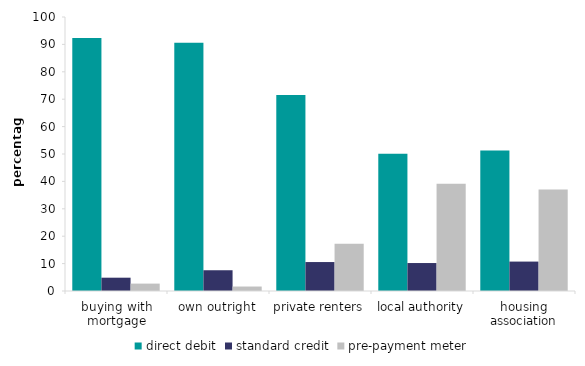
| Category | direct debit | standard credit | pre-payment meter |
|---|---|---|---|
| buying with mortgage | 92.344 | 4.857 | 2.696 |
| own outright | 90.574 | 7.576 | 1.632 |
| private renters | 71.561 | 10.567 | 17.222 |
| local authority | 50.105 | 10.208 | 39.144 |
| housing association | 51.279 | 10.737 | 37.038 |